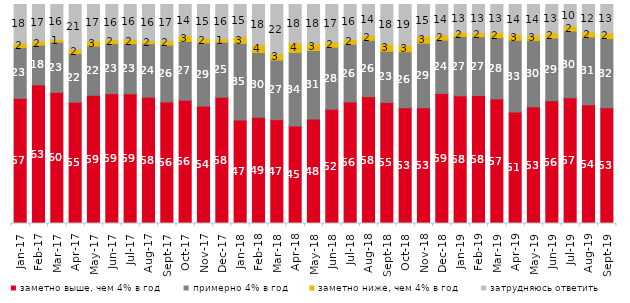
| Category | заметно выше, чем 4% в год | примерно 4% в год | заметно ниже, чем 4% в год | затрудняюсь ответить |
|---|---|---|---|---|
| 2017-01-01 | 57.15 | 23.15 | 2 | 17.7 |
| 2017-02-01 | 63.35 | 18.1 | 1.9 | 16.65 |
| 2017-03-01 | 59.9 | 22.9 | 1.25 | 15.95 |
| 2017-04-01 | 55.35 | 22.15 | 1.95 | 20.5 |
| 2017-05-01 | 58.55 | 22.45 | 2.5 | 16.5 |
| 2017-06-01 | 59.25 | 22.85 | 1.8 | 16.05 |
| 2017-07-01 | 59.2 | 22.85 | 2.1 | 15.8 |
| 2017-08-01 | 57.7 | 24.4 | 1.55 | 16.35 |
| 2017-09-01 | 55.5 | 25.95 | 1.95 | 16.6 |
| 2017-10-01 | 56.3 | 26.8 | 2.65 | 14.25 |
| 2017-11-01 | 53.6 | 28.9 | 2.05 | 15.45 |
| 2017-12-01 | 57.65 | 25.15 | 1.45 | 15.75 |
| 2018-01-01 | 47.25 | 35 | 3 | 14.75 |
| 2018-02-01 | 48.5 | 29.6 | 3.5 | 18.4 |
| 2018-03-01 | 47.4 | 27.25 | 2.9 | 22.45 |
| 2018-04-01 | 44.55 | 33.55 | 4.3 | 17.6 |
| 2018-05-01 | 47.7 | 31.3 | 3.25 | 17.75 |
| 2018-06-01 | 52.2 | 28.3 | 2.4 | 17.1 |
| 2018-07-01 | 55.5 | 26.35 | 2.25 | 15.9 |
| 2018-08-01 | 57.95 | 25.65 | 2.3 | 14.1 |
| 2018-09-01 | 55.3 | 23.35 | 3.25 | 18.1 |
| 2018-10-01 | 52.85 | 25.55 | 2.95 | 18.65 |
| 2018-11-01 | 52.844 | 29.491 | 3.144 | 14.521 |
| 2018-12-01 | 59.4 | 24.35 | 2.35 | 13.9 |
| 2019-01-01 | 58.3 | 27.05 | 2 | 12.65 |
| 2019-02-01 | 58.45 | 26.8 | 1.85 | 12.9 |
| 2019-03-01 | 56.887 | 27.946 | 2.387 | 12.78 |
| 2019-04-01 | 50.891 | 32.772 | 2.574 | 13.762 |
| 2019-05-01 | 53.343 | 30.163 | 2.526 | 13.967 |
| 2019-06-01 | 56.06 | 28.579 | 2.444 | 12.918 |
| 2019-07-01 | 57.475 | 30.396 | 2.228 | 9.901 |
| 2019-08-01 | 54.246 | 30.869 | 2.398 | 12.488 |
| 2019-09-01 | 52.822 | 31.634 | 2.475 | 13.069 |